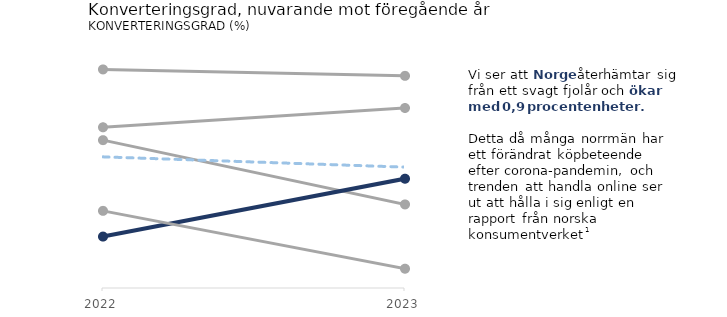
| Category | SV | FI | DK | NO | EE | MDL |
|---|---|---|---|---|---|---|
| 2022.0 | 5.9 | 5 | 4.8 | 3.3 | 3.7 | 4.54 |
| 2023.0 | 5.8 | 5.3 | 3.8 | 4.2 | 2.8 | 4.38 |